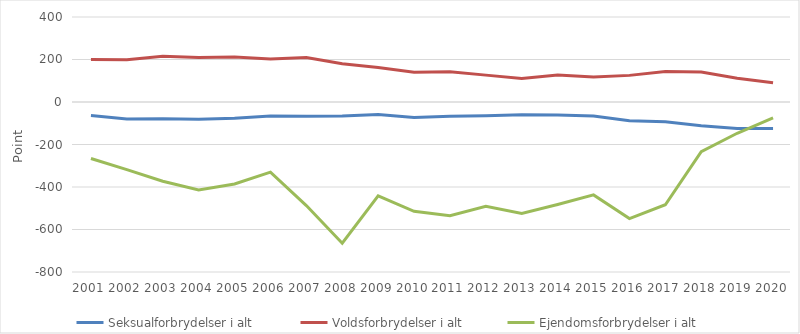
| Category | Seksualforbrydelser i alt  | Voldsforbrydelser i alt | Ejendomsforbrydelser i alt |
|---|---|---|---|
| 2001 | -63.9 | 199.7 | -266.1 |
| 2002 | -79.6 | 199.1 | -318.4 |
| 2003 | -78.5 | 215.4 | -372.9 |
| 2004 | -81.5 | 209.6 | -414.2 |
| 2005 | -76 | 211.8 | -386 |
| 2006 | -66.4 | 202.6 | -329.9 |
| 2007 | -67.1 | 209.8 | -487.2 |
| 2008 | -66.1 | 179.8 | -664.6 |
| 2009 | -58.7 | 162 | -441.8 |
| 2010 | -72.6 | 139.6 | -514.6 |
| 2011 | -67.5 | 142.4 | -534.7 |
| 2012 | -65.2 | 126.5 | -490.9 |
| 2013 | -60.5 | 110.3 | -524.3 |
| 2014 | -60.6 | 126.5 | -482.6 |
| 2015 | -65.9 | 117.1 | -437.2 |
| 2016 | -88.4 | 125.3 | -548.6 |
| 2017 | -93.2 | 143 | -483.4 |
| 2018 | -111.3 | 140.8 | -234.2 |
| 2019 | -124.9 | 111.8 | -147.1 |
| 2020 | -124.2 | 90.4 | -74.4 |